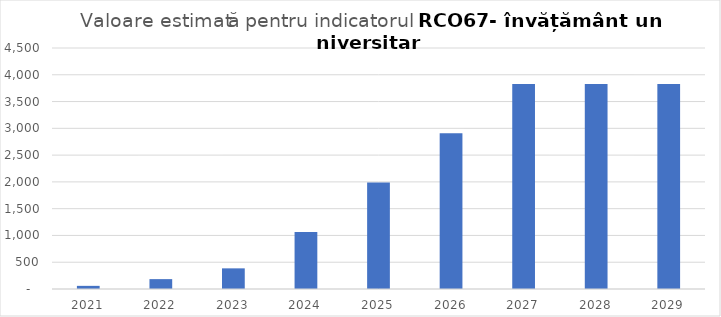
| Category | Series 0 |
|---|---|
| 2021.0 | 58.666 |
| 2022.0 | 184.378 |
| 2023.0 | 385.519 |
| 2024.0 | 1064.366 |
| 2025.0 | 1986.259 |
| 2026.0 | 2908.151 |
| 2027.0 | 3830.043 |
| 2028.0 | 3830.043 |
| 2029.0 | 3830.043 |